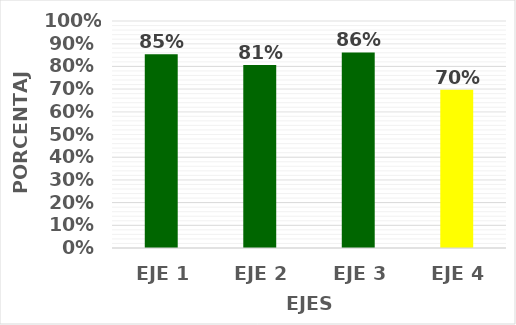
| Category | Series 0 |
|---|---|
| EJE 1 | 0.854 |
| EJE 2 | 0.807 |
| EJE 3 | 0.862 |
| EJE 4 | 0.697 |